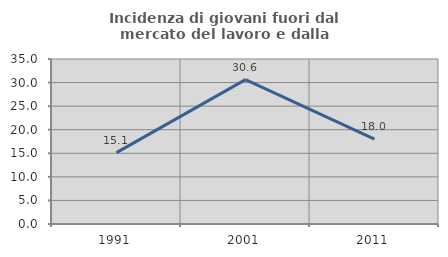
| Category | Incidenza di giovani fuori dal mercato del lavoro e dalla formazione  |
|---|---|
| 1991.0 | 15.129 |
| 2001.0 | 30.623 |
| 2011.0 | 17.987 |